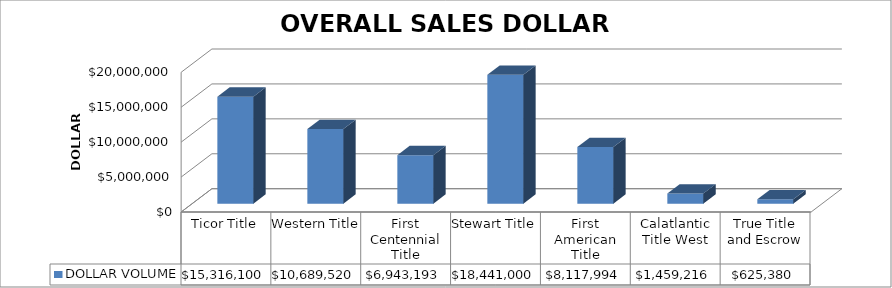
| Category | DOLLAR VOLUME |
|---|---|
| Ticor Title | 15316100 |
| Western Title | 10689520 |
| First Centennial Title | 6943193 |
| Stewart Title | 18441000 |
| First American Title | 8117993.89 |
| Calatlantic Title West | 1459216 |
| True Title and Escrow | 625380 |